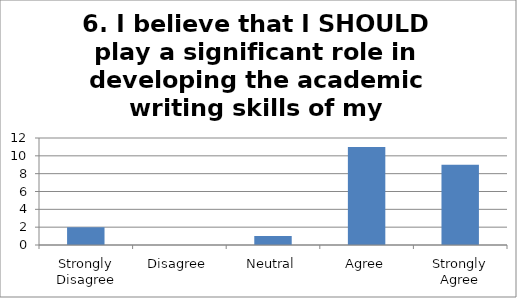
| Category | 6. I believe that I SHOULD play a significant role in developing the academic writing skills of my students. Responses |
|---|---|
| Strongly Disagree | 2 |
| Disagree | 0 |
| Neutral | 1 |
| Agree | 11 |
| Strongly Agree | 9 |